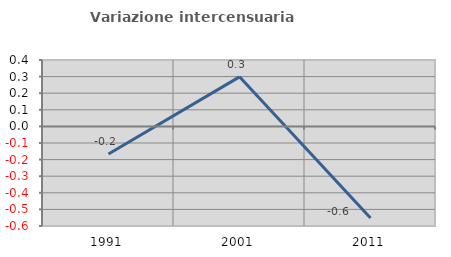
| Category | Variazione intercensuaria annua |
|---|---|
| 1991.0 | -0.167 |
| 2001.0 | 0.298 |
| 2011.0 | -0.552 |